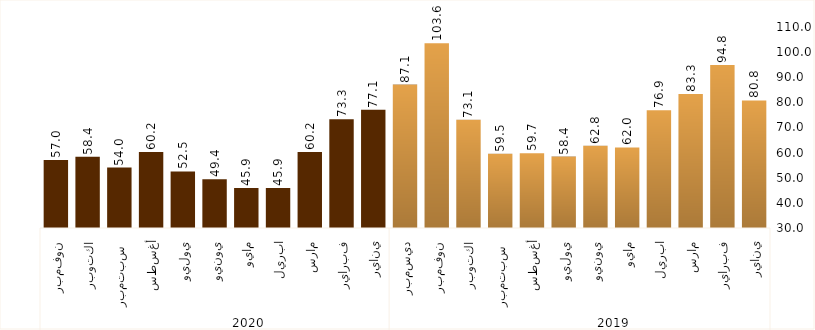
| Category | Series 0 |
|---|---|
| 0 | 80.765 |
| 1 | 94.841 |
| 2 | 83.319 |
| 3 | 76.897 |
| 4 | 62.044 |
| 5 | 62.752 |
| 6 | 58.429 |
| 7 | 59.728 |
| 8 | 59.514 |
| 9 | 73.083 |
| 10 | 103.577 |
| 11 | 87.092 |
| 12 | 77.074 |
| 13 | 73.326 |
| 14 | 60.245 |
| 15 | 45.901 |
| 16 | 45.909 |
| 17 | 49.381 |
| 18 | 52.523 |
| 19 | 60.223 |
| 20 | 54.046 |
| 21 | 58.358 |
| 22 | 57.041 |